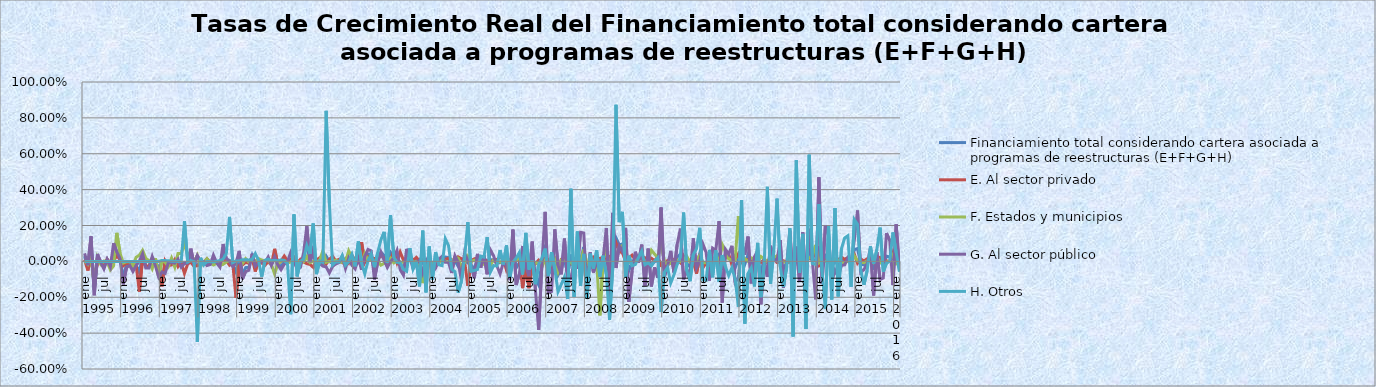
| Category | Financiamiento total considerando cartera asociada a programas de reestructuras (E+F+G+H)  | E. Al sector privado  | F. Estados y municipios  | G. Al sector público  | H. Otros  |
|---|---|---|---|---|---|
| 0 | 0.029 | 0.01 | 0.003 | 0.045 | 0 |
| 1 | -0.033 | -0.051 | -0.016 | -0.022 | 0 |
| 2 | 0.092 | 0.028 | 0.031 | 0.14 | 0 |
| 3 | -0.159 | -0.112 | -0.131 | -0.189 | 0 |
| 4 | 0.024 | -0.002 | 0.022 | 0.041 | 0 |
| 5 | -0.004 | 0.001 | -0.016 | -0.006 | 0 |
| 6 | -0.034 | -0.025 | 0.002 | -0.042 | 0 |
| 7 | 0.011 | 0.013 | -0.002 | 0.011 | 0 |
| 8 | -0.024 | -0.011 | -0.048 | -0.031 | 0 |
| 9 | 0.059 | 0.003 | -0.025 | 0.101 | 0 |
| 10 | 0.049 | 0.032 | 0.159 | 0.053 | 0 |
| 11 | 0.015 | 0.01 | 0.046 | 0.016 | 0 |
| 12 | -0.086 | -0.025 | -0.01 | -0.128 | 0 |
| 13 | -0.024 | -0.01 | -0.002 | -0.035 | 0 |
| 14 | -0.018 | -0.015 | -0.003 | -0.022 | 0 |
| 15 | -0.043 | -0.024 | -0.024 | -0.057 | 0 |
| 16 | -0.02 | -0.02 | 0.023 | -0.024 | 0 |
| 17 | -0.062 | -0.169 | 0.034 | 0.003 | 0 |
| 18 | 0.035 | 0.016 | 0.062 | 0.043 | 0 |
| 19 | -0.03 | -0.028 | 0.017 | -0.037 | 0 |
| 20 | -0.03 | -0.025 | 0.004 | -0.037 | 0 |
| 21 | 0.02 | 0.018 | -0.04 | 0.027 | 0 |
| 22 | -0.017 | -0.007 | 0.018 | -0.026 | 0 |
| 23 | -0.026 | -0.051 | -0.088 | -0.088 | 0 |
| 24 | -0.079 | -0.139 | 0.003 | -0.059 | 0.005 |
| 25 | -0.037 | 0.004 | -0.005 | -0.067 | 0.005 |
| 26 | -0.013 | -0.023 | -0.029 | -0.007 | 0.003 |
| 27 | -0.009 | -0.02 | 0.019 | -0.008 | 0.001 |
| 28 | -0.004 | 0.01 | -0.031 | -0.01 | 0.001 |
| 29 | 0 | -0.029 | 0.044 | 0.013 | 0 |
| 30 | -0.017 | -0.006 | 0.044 | -0.032 | 0 |
| 31 | -0.007 | -0.067 | 0.099 | -0.012 | 0.224 |
| 32 | -0.007 | -0.014 | 0.033 | -0.009 | -0.003 |
| 33 | 0.042 | -0.005 | 0.053 | 0.071 | 0.004 |
| 34 | -0.02 | -0.029 | -0.003 | -0.02 | -0.001 |
| 35 | -0.018 | -0.024 | 0.034 | 0.033 | -0.449 |
| 36 | -0.004 | -0.016 | -0.029 | 0.004 | 0.019 |
| 37 | -0.004 | -0.009 | -0.003 | -0.001 | -0.02 |
| 38 | -0.008 | 0.015 | 0.015 | -0.023 | 0 |
| 39 | -0.013 | -0.006 | -0.008 | -0.018 | -0.001 |
| 40 | 0.014 | -0.014 | -0.02 | 0.035 | -0.004 |
| 41 | -0.007 | -0.005 | -0.011 | -0.008 | 0.002 |
| 42 | -0.026 | -0.021 | -0.022 | -0.032 | 0.004 |
| 43 | 0.062 | 0.019 | -0.017 | 0.097 | 0.013 |
| 44 | 0.011 | 0.004 | -0.003 | 0.015 | 0.043 |
| 45 | 0.006 | -0.022 | 0.002 | 0.001 | 0.248 |
| 46 | -0.021 | -0.01 | -0.008 | -0.029 | -0.007 |
| 47 | -0.06 | -0.204 | -0.001 | -0.012 | 0.002 |
| 48 | 0.034 | -0.024 | 0.022 | 0.059 | 0.001 |
| 49 | -0.07 | -0.02 | -0.013 | -0.099 | 0.01 |
| 50 | -0.035 | -0.006 | 0.015 | -0.056 | 0.01 |
| 51 | -0.033 | -0.011 | -0.004 | -0.05 | 0.008 |
| 52 | 0.031 | 0.018 | 0.005 | 0.043 | 0.011 |
| 53 | -0.027 | -0.057 | 0.001 | -0.027 | 0.043 |
| 54 | -0.004 | 0.007 | 0.016 | -0.012 | 0.006 |
| 55 | -0.008 | -0.009 | 0.007 | -0.002 | -0.085 |
| 56 | -0.008 | -0.022 | 0.003 | -0.007 | 0.006 |
| 57 | 0.016 | -0.001 | 0.005 | 0.024 | 0.013 |
| 58 | -0.019 | -0.021 | -0.017 | -0.022 | 0.004 |
| 59 | 0.024 | 0.07 | -0.07 | 0.025 | 0.005 |
| 60 | -0.017 | -0.015 | -0.016 | -0.02 | 0.003 |
| 61 | -0.027 | 0.001 | 0.003 | -0.047 | 0.008 |
| 62 | -0.002 | 0.03 | 0.005 | -0.016 | 0.005 |
| 63 | -0.002 | 0.004 | -0.01 | -0.001 | -0.013 |
| 64 | 0.012 | 0.013 | -0.003 | 0.05 | -0.295 |
| 65 | 0.018 | 0.024 | 0.001 | 0 | 0.262 |
| 66 | -0.033 | -0.01 | 0.002 | -0.043 | -0.084 |
| 67 | -0.018 | 0.011 | -0.011 | -0.034 | 0.001 |
| 68 | 0.027 | -0.003 | -0.003 | 0.047 | 0.012 |
| 69 | 0.122 | -0.013 | 0.027 | 0.196 | 0.088 |
| 70 | -0.005 | -0.017 | -0.007 | -0.004 | 0.041 |
| 71 | 0.06 | -0.033 | 0.001 | 0.086 | 0.211 |
| 72 | -0.029 | 0.008 | -0.002 | -0.039 | -0.071 |
| 73 | -0.004 | 0.02 | 0.005 | -0.013 | 0.003 |
| 74 | -0.013 | -0.004 | 0.061 | -0.027 | -0.006 |
| 75 | 0.03 | -0.015 | -0.005 | -0.031 | 0.839 |
| 76 | 0 | 0.011 | 0 | -0.064 | 0.324 |
| 77 | -0.013 | 0.029 | 0 | -0.028 | -0.021 |
| 78 | -0.007 | 0.002 | 0.007 | -0.015 | -0.002 |
| 79 | -0.002 | 0.012 | -0.005 | -0.007 | -0.003 |
| 80 | 0.019 | -0.006 | -0.005 | 0.029 | 0.033 |
| 81 | -0.022 | 0.015 | -0.004 | -0.04 | -0.022 |
| 82 | 0.013 | -0.009 | 0.059 | 0.018 | -0.001 |
| 83 | 0.004 | 0.035 | 0.021 | -0.022 | 0.039 |
| 84 | -0.026 | 0.004 | -0.006 | -0.042 | -0.027 |
| 85 | 0.025 | -0.006 | 0.017 | 0.015 | 0.111 |
| 86 | -0.003 | 0.107 | -0.009 | -0.047 | -0.009 |
| 87 | 0.005 | -0.006 | 0.044 | 0.028 | -0.069 |
| 88 | 0.041 | 0.027 | 0.007 | 0.067 | 0.004 |
| 89 | 0.041 | 0.016 | 0.008 | 0.058 | 0.042 |
| 90 | -0.054 | 0.016 | -0.001 | -0.101 | -0.032 |
| 91 | 0.007 | 0.011 | 0.004 | -0.006 | 0.048 |
| 92 | 0.051 | 0.034 | -0.021 | 0.052 | 0.12 |
| 93 | 0.034 | 0.017 | -0.011 | 0.007 | 0.165 |
| 94 | -0.014 | 0.017 | -0.004 | -0.034 | -0.009 |
| 95 | 0.05 | 0.001 | 0.018 | -0.001 | 0.258 |
| 96 | 0.027 | 0.059 | -0.008 | 0.019 | 0.024 |
| 97 | 0.025 | -0.006 | 0.002 | 0.061 | -0.005 |
| 98 | -0.011 | 0.052 | -0.004 | -0.047 | -0.007 |
| 99 | -0.043 | 0.006 | -0.005 | -0.077 | -0.044 |
| 100 | 0.022 | 0.018 | 0.001 | 0.07 | -0.055 |
| 101 | 0.034 | 0.031 | 0.015 | 0.021 | 0.074 |
| 102 | -0.025 | 0.005 | -0.004 | -0.04 | -0.042 |
| 103 | 0 | 0.022 | -0.003 | -0.013 | 0.002 |
| 104 | -0.025 | 0.003 | -0.009 | 0.008 | -0.139 |
| 105 | -0.003 | 0.011 | -0.121 | -0.062 | 0.171 |
| 106 | -0.035 | 0.011 | -0.011 | 0.001 | -0.173 |
| 107 | 0.032 | 0.005 | 0.023 | 0.032 | 0.083 |
| 108 | -0.051 | -0.013 | -0.023 | -0.06 | -0.102 |
| 109 | -0.006 | 0.006 | -0.014 | -0.038 | 0.052 |
| 110 | 0.004 | 0.011 | -0.01 | 0.012 | -0.019 |
| 111 | 0.009 | 0.001 | 0.018 | 0.028 | -0.024 |
| 112 | 0.025 | 0.01 | 0.001 | -0.005 | 0.127 |
| 113 | 0.021 | 0.018 | -0.005 | -0.005 | 0.088 |
| 114 | -0.033 | 0.009 | -0.006 | -0.065 | -0.044 |
| 115 | 0.002 | 0 | 0.022 | 0.032 | -0.057 |
| 116 | -0.027 | 0.025 | 0.018 | -0.004 | -0.174 |
| 117 | -0.059 | 0.015 | -0.029 | -0.105 | -0.111 |
| 118 | 0.021 | -0.001 | -0.007 | 0.046 | 0.023 |
| 119 | -0.009 | -0.136 | 0.029 | 0.005 | 0.219 |
| 120 | -0.02 | 0.004 | -0.001 | -0.024 | -0.055 |
| 121 | -0.043 | 0.014 | 0.007 | -0.094 | -0.051 |
| 122 | 0.014 | 0.019 | -0.003 | 0.042 | -0.045 |
| 123 | -0.008 | 0.002 | -0.003 | -0.034 | 0.029 |
| 124 | 0.02 | 0.012 | -0.016 | 0.034 | 0.024 |
| 125 | -0.002 | 0.003 | -0.008 | -0.072 | 0.135 |
| 126 | 0.007 | -0.003 | -0.023 | 0.064 | -0.06 |
| 127 | 0.01 | 0.007 | 0.009 | 0.031 | -0.024 |
| 128 | -0.011 | 0.01 | -0.004 | -0.024 | -0.025 |
| 129 | -0.007 | 0.022 | -0.002 | -0.07 | 0.063 |
| 130 | -0.001 | 0.017 | -0.012 | -0.008 | -0.017 |
| 131 | -0.009 | -0.049 | 0.015 | -0.026 | 0.089 |
| 132 | -0.062 | -0.018 | 0.009 | -0.105 | -0.092 |
| 133 | 0.065 | 0.02 | -0.007 | 0.177 | -0.004 |
| 134 | -0.037 | 0.021 | 0.006 | -0.132 | 0.018 |
| 135 | -0.007 | 0.011 | 0.018 | -0.07 | 0.05 |
| 136 | -0.046 | -0.149 | 0.003 | 0.086 | -0.073 |
| 137 | 0.015 | -0.034 | 0.026 | -0.029 | 0.159 |
| 138 | -0.089 | -0.149 | -0.016 | -0.083 | -0.046 |
| 139 | 0.034 | -0.017 | -0.002 | 0.11 | 0.005 |
| 140 | -0.097 | -0.014 | -0.01 | -0.164 | -0.127 |
| 141 | -0.132 | 0.008 | -0.01 | -0.382 | -0.015 |
| 142 | -0.003 | -0.002 | -0.032 | -0.015 | 0.018 |
| 143 | 0.093 | 0.017 | 0.008 | 0.276 | 0.071 |
| 144 | -0.075 | -0.017 | 0.011 | -0.175 | -0.082 |
| 145 | -0.041 | -0.032 | -0.012 | -0.168 | 0.052 |
| 146 | 0.025 | -0.009 | 0.014 | 0.178 | -0.04 |
| 147 | -0.077 | -0.05 | -0.056 | -0.022 | -0.169 |
| 148 | -0.046 | 0.012 | 0.007 | -0.072 | -0.129 |
| 149 | 0.021 | 0.019 | 0.007 | 0.127 | -0.086 |
| 150 | -0.075 | -0.009 | -0.007 | -0.099 | -0.21 |
| 151 | 0.038 | -0.015 | -0.006 | -0.096 | 0.405 |
| 152 | -0.046 | 0.01 | -0.026 | 0.002 | -0.198 |
| 153 | 0.031 | 0.027 | -0.018 | -0.042 | 0.167 |
| 154 | 0.005 | -0.003 | -0.003 | 0.162 | -0.137 |
| 155 | 0.08 | 0.051 | 0.066 | 0.158 | 0.041 |
| 156 | -0.108 | -0.03 | -0.019 | -0.188 | -0.207 |
| 157 | 0.017 | -0.002 | -0.014 | 0.05 | 0.043 |
| 158 | -0.016 | 0.022 | -0.013 | -0.062 | -0.04 |
| 159 | 0.009 | 0 | -0.004 | -0.001 | 0.061 |
| 160 | -0.048 | 0.017 | -0.301 | 0.005 | -0.085 |
| 161 | 0.02 | 0.022 | 0.013 | 0.013 | 0.031 |
| 162 | 0.048 | 0.007 | 0.066 | 0.186 | -0.073 |
| 163 | -0.112 | 0.026 | -0.03 | -0.234 | -0.326 |
| 164 | 0.085 | 0.036 | -0.004 | 0.271 | -0.034 |
| 165 | 0.131 | 0.104 | 0.032 | -0.037 | 0.873 |
| 166 | 0.093 | 0.055 | 0.078 | 0.086 | 0.219 |
| 167 | 0.096 | 0.049 | 0.088 | 0.054 | 0.276 |
| 168 | 0.027 | -0.002 | 0.007 | 0.187 | -0.088 |
| 169 | -0.051 | 0.02 | -0.003 | -0.226 | 0.031 |
| 170 | -0.003 | 0.035 | -0.013 | -0.053 | -0.023 |
| 171 | 0.013 | 0.01 | -0.002 | 0.054 | -0.017 |
| 172 | 0.01 | 0.011 | 0.029 | -0.007 | 0.021 |
| 173 | 0.046 | 0.024 | 0.016 | 0.093 | 0.058 |
| 174 | -0.027 | 0.02 | 0.002 | -0.136 | -0.018 |
| 175 | 0.016 | 0.004 | 0.008 | 0.071 | -0.008 |
| 176 | -0.022 | 0.017 | 0.062 | -0.14 | -0.025 |
| 177 | 0 | 0.004 | 0.04 | -0.034 | 0.003 |
| 178 | 0.002 | 0.026 | 0.021 | -0.091 | 0.02 |
| 179 | -0.006 | -0.024 | 0.116 | 0.301 | -0.282 |
| 180 | -0.041 | -0.024 | -0.002 | -0.088 | -0.062 |
| 181 | -0.011 | 0.004 | -0.019 | -0.027 | -0.034 |
| 182 | -0.01 | -0.008 | -0.012 | 0.059 | -0.12 |
| 183 | -0.017 | 0.011 | 0.003 | -0.062 | -0.075 |
| 184 | 0.023 | 0.008 | 0.007 | 0.095 | -0.018 |
| 185 | 0.041 | -0.008 | -0.001 | 0.182 | 0.023 |
| 186 | 0.021 | 0.032 | 0.009 | -0.1 | 0.272 |
| 187 | -0.012 | 0.004 | 0.027 | -0.044 | -0.054 |
| 188 | -0.03 | 0.004 | -0.004 | -0.074 | -0.111 |
| 189 | 0.031 | -0.003 | 0.005 | 0.128 | 0.037 |
| 190 | -0.036 | -0.069 | -0.001 | -0.036 | 0.07 |
| 191 | 0.043 | 0.024 | 0.035 | 0.004 | 0.187 |
| 192 | -0.012 | -0.035 | -0.007 | 0.096 | -0.103 |
| 193 | -0.008 | -0.009 | -0.008 | 0.049 | -0.105 |
| 194 | -0.019 | 0.002 | -0.001 | -0.107 | 0.064 |
| 195 | 0.002 | -0.002 | -0.016 | 0.073 | -0.089 |
| 196 | 0.029 | 0.001 | 0.038 | 0.062 | 0.062 |
| 197 | 0.041 | -0.006 | -0.009 | 0.224 | -0.113 |
| 198 | -0.046 | 0.023 | 0.094 | -0.229 | 0.035 |
| 199 | 0.031 | 0.022 | 0.054 | 0.066 | -0.03 |
| 200 | 0.023 | 0.041 | 0.013 | 0.04 | -0.079 |
| 201 | 0.011 | -0.021 | 0.009 | 0.087 | -0.035 |
| 202 | -0.037 | 0.012 | 0.007 | -0.117 | -0.1 |
| 203 | 0.012 | 0.043 | 0.253 | -0.092 | -0.252 |
| 204 | 0.046 | -0.007 | 0.027 | 0.094 | 0.342 |
| 205 | -0.016 | 0.003 | 0.015 | 0.037 | -0.347 |
| 206 | 0.038 | 0.011 | 0 | 0.138 | -0.067 |
| 207 | -0.029 | 0.008 | 0.019 | -0.122 | -0.036 |
| 208 | 0.012 | 0.024 | 0.006 | 0.025 | -0.14 |
| 209 | 0.018 | -0.004 | -0.005 | 0.061 | 0.103 |
| 210 | -0.072 | -0.006 | 0.027 | -0.239 | -0.199 |
| 211 | 0.009 | 0.009 | 0.016 | 0.008 | -0.02 |
| 212 | -0.007 | -0.005 | -0.005 | -0.086 | 0.416 |
| 213 | 0.017 | 0.001 | 0.029 | 0.087 | -0.126 |
| 214 | 0.019 | 0.017 | 0.02 | 0.013 | 0.059 |
| 215 | 0.021 | -0.006 | 0.031 | 0.001 | 0.35 |
| 216 | 0.023 | -0.003 | 0.005 | 0.119 | -0.028 |
| 217 | -0.043 | 0.003 | -0.004 | -0.148 | -0.141 |
| 218 | -0.007 | -0.003 | -0.003 | -0.011 | -0.034 |
| 219 | 0.044 | -0.006 | 0.005 | 0.171 | 0.185 |
| 220 | -0.039 | 0.022 | 0.004 | -0.106 | -0.418 |
| 221 | 0.052 | 0.016 | 0.02 | 0.083 | 0.564 |
| 222 | -0.032 | -0.004 | -0.002 | -0.115 | -0.064 |
| 223 | 0.055 | 0.023 | 0.01 | 0.162 | 0.153 |
| 224 | -0.041 | 0.013 | 0.008 | -0.121 | -0.377 |
| 225 | 0.072 | 0.015 | 0.019 | 0.182 | 0.595 |
| 226 | 0.011 | 0.011 | 0.03 | -0.001 | -0.012 |
| 227 | 0.002 | 0.06 | 0.092 | -0.211 | -0.017 |
| 228 | 0.084 | -0.025 | -0.009 | 0.469 | 0.319 |
| 229 | -0.043 | -0.019 | -0.002 | -0.125 | -0.057 |
| 230 | 0.028 | 0.006 | -0.001 | 0.198 | -0.264 |
| 231 | 0.053 | 0.014 | -0.004 | 0.148 | 0.197 |
| 232 | -0.036 | 0.007 | 0.009 | -0.107 | -0.212 |
| 233 | 0.007 | 0.009 | 0.012 | -0.049 | 0.298 |
| 234 | -0.027 | 0.008 | 0.005 | -0.088 | -0.195 |
| 235 | 0.009 | 0.024 | -0.005 | -0.023 | 0.07 |
| 236 | 0.006 | 0.011 | -0.007 | -0.019 | 0.131 |
| 237 | 0.023 | 0.02 | 0 | 0.019 | 0.143 |
| 238 | -0.004 | 0.013 | -0.008 | -0.003 | -0.142 |
| 239 | 0.065 | 0.041 | 0.031 | 0.118 | 0.233 |
| 240 | 0.072 | -0.01 | 0.003 | 0.284 | 0.207 |
| 241 | -0.014 | 0.014 | -0.005 | -0.061 | -0.049 |
| 242 | -0.021 | 0.002 | -0.007 | -0.045 | -0.131 |
| 243 | 0.001 | 0.015 | 0.003 | -0.014 | -0.05 |
| 244 | 0.032 | 0.017 | 0.002 | 0.073 | 0.085 |
| 245 | -0.046 | 0.009 | -0.008 | -0.19 | -0.013 |
| 246 | 0.029 | 0.016 | 0.027 | 0.052 | 0.066 |
| 247 | 0 | 0.023 | -0.007 | -0.101 | 0.188 |
| 248 | -0.022 | 0.005 | -0.012 | -0.093 | -0.058 |
| 249 | 0.029 | 0.003 | -0.003 | 0.157 | -0.01 |
| 250 | 0.024 | 0 | -0.001 | 0.116 | 0.001 |
| 251 | 0.015 | 0.052 | 0.035 | -0.132 | 0.161 |
| 252 | 0.044 | 0.005 | -0.014 | 0.207 | 0.05 |
| 253 | -0.022 | -0.014 | -0.008 | -0.039 | -0.058 |